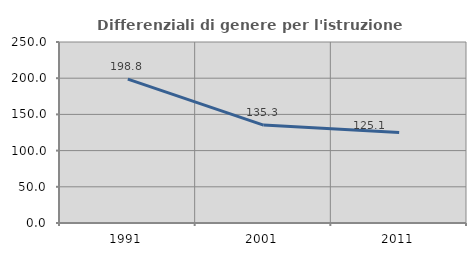
| Category | Differenziali di genere per l'istruzione superiore |
|---|---|
| 1991.0 | 198.822 |
| 2001.0 | 135.287 |
| 2011.0 | 125.111 |